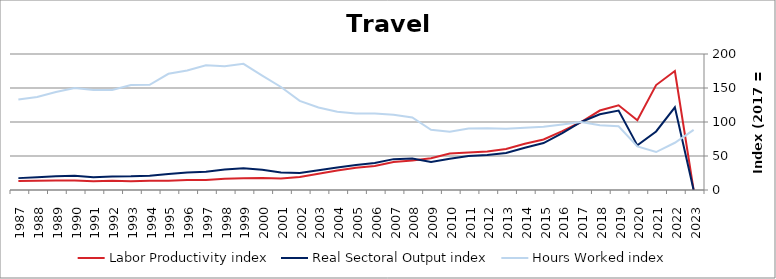
| Category | Labor Productivity index | Real Sectoral Output index | Hours Worked index |
|---|---|---|---|
| 2023.0 | 0 | 0 | 88.491 |
| 2022.0 | 174.972 | 121.531 | 69.457 |
| 2021.0 | 154.314 | 86.133 | 55.817 |
| 2020.0 | 102.556 | 65.649 | 64.013 |
| 2019.0 | 124.546 | 116.716 | 93.713 |
| 2018.0 | 116.863 | 111.434 | 95.355 |
| 2017.0 | 100 | 100 | 100 |
| 2016.0 | 86.654 | 83.584 | 96.458 |
| 2015.0 | 74.313 | 69.063 | 92.935 |
| 2014.0 | 68.007 | 62.243 | 91.524 |
| 2013.0 | 60.385 | 54.347 | 90.002 |
| 2012.0 | 56.639 | 51.496 | 90.919 |
| 2011.0 | 55.178 | 49.824 | 90.297 |
| 2010.0 | 53.801 | 46.092 | 85.671 |
| 2009.0 | 46.648 | 41.3 | 88.537 |
| 2008.0 | 43.553 | 46.445 | 106.639 |
| 2007.0 | 41.011 | 45.377 | 110.646 |
| 2006.0 | 35.264 | 39.681 | 112.526 |
| 2005.0 | 32.759 | 36.827 | 112.419 |
| 2004.0 | 28.683 | 32.972 | 114.953 |
| 2003.0 | 23.819 | 28.884 | 121.266 |
| 2002.0 | 19.163 | 25.113 | 131.051 |
| 2001.0 | 17.029 | 25.799 | 151.496 |
| 2000.0 | 17.793 | 29.921 | 168.16 |
| 1999.0 | 17.153 | 31.821 | 185.505 |
| 1998.0 | 16.468 | 29.972 | 181.998 |
| 1997.0 | 14.724 | 26.99 | 183.302 |
| 1996.0 | 14.744 | 25.905 | 175.695 |
| 1995.0 | 13.695 | 23.407 | 170.92 |
| 1994.0 | 13.582 | 21.011 | 154.694 |
| 1993.0 | 13 | 20.089 | 154.534 |
| 1992.0 | 13.594 | 19.994 | 147.083 |
| 1991.0 | 12.836 | 18.9 | 147.241 |
| 1990.0 | 13.891 | 20.818 | 149.864 |
| 1989.0 | 13.93 | 20.09 | 144.226 |
| 1988.0 | 13.702 | 18.729 | 136.688 |
| 1987.0 | 13.121 | 17.463 | 133.085 |